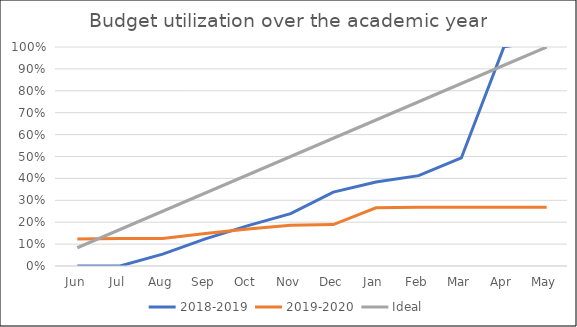
| Category | 2018-2019 | 2019-2020 | Ideal |
|---|---|---|---|
| Jun | 0 | 0.124 | 0.083 |
| Jul | 0 | 0.126 | 0.167 |
| Aug | 0.054 | 0.126 | 0.25 |
| Sep | 0.124 | 0.148 | 0.333 |
| Oct | 0.184 | 0.169 | 0.417 |
| Nov | 0.239 | 0.186 | 0.5 |
| Dec | 0.337 | 0.189 | 0.583 |
| Jan | 0.384 | 0.266 | 0.667 |
| Feb | 0.413 | 0.269 | 0.75 |
| Mar | 0.493 | 0.269 | 0.833 |
| Apr | 1.001 | 0.269 | 0.917 |
| May | 1.031 | 0.269 | 1 |